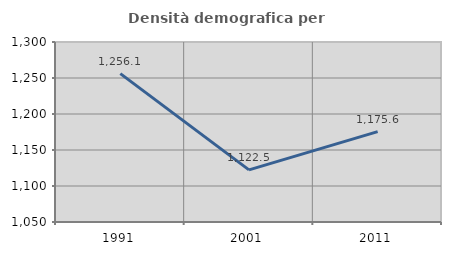
| Category | Densità demografica |
|---|---|
| 1991.0 | 1256.062 |
| 2001.0 | 1122.461 |
| 2011.0 | 1175.586 |